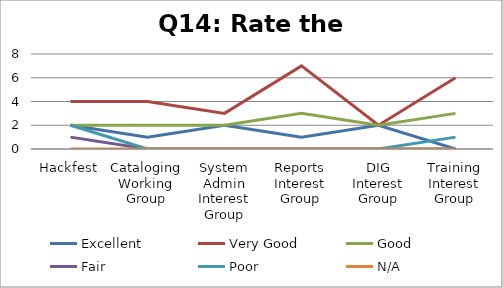
| Category | Excellent | Very Good | Good | Fair | Poor | N/A |
|---|---|---|---|---|---|---|
| Hackfest | 2 | 4 | 2 | 1 | 2 | 0 |
| Cataloging Working Group | 1 | 4 | 2 | 0 | 0 | 0 |
| System Admin Interest Group | 2 | 3 | 2 | 0 | 0 | 0 |
| Reports Interest Group | 1 | 7 | 3 | 0 | 0 | 0 |
| DIG Interest Group | 2 | 2 | 2 | 0 | 0 | 0 |
| Training Interest Group | 0 | 6 | 3 | 0 | 1 | 0 |